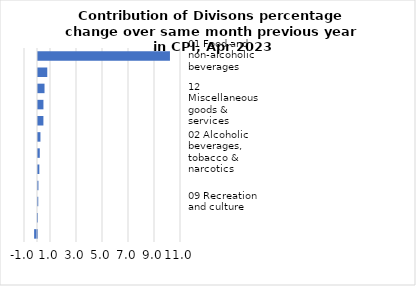
| Category |     Contributions |
|---|---|
| 01 Food and non-alcoholic beverages | 10.151 |
| 08 Communication | 0.713 |
| 07 Transport | 0.502 |
| 12 Miscellaneous goods & services | 0.419 |
| 11 Restaurants and hotels | 0.416 |
| 04 Housing, water, electricity, gas & other fuels | 0.188 |
| 02 Alcoholic beverages, tobacco & narcotics | 0.137 |
| 05 Furnishings, household equipment & maintenance | 0.104 |
| 03 Clothing and footwear | 0.033 |
| 09 Recreation and culture | 0.02 |
| 06 Health | -0.009 |
| 10 Education | -0.221 |